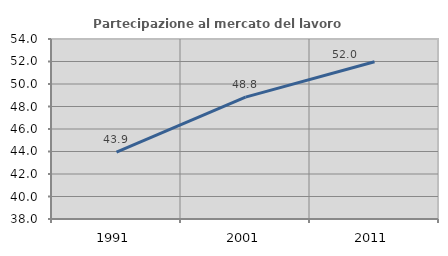
| Category | Partecipazione al mercato del lavoro  femminile |
|---|---|
| 1991.0 | 43.937 |
| 2001.0 | 48.837 |
| 2011.0 | 51.978 |